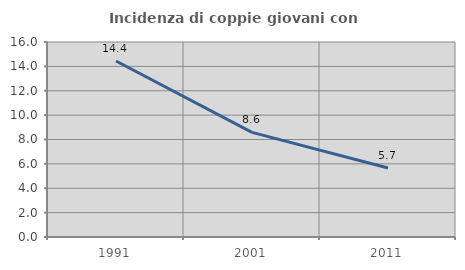
| Category | Incidenza di coppie giovani con figli |
|---|---|
| 1991.0 | 14.441 |
| 2001.0 | 8.584 |
| 2011.0 | 5.668 |